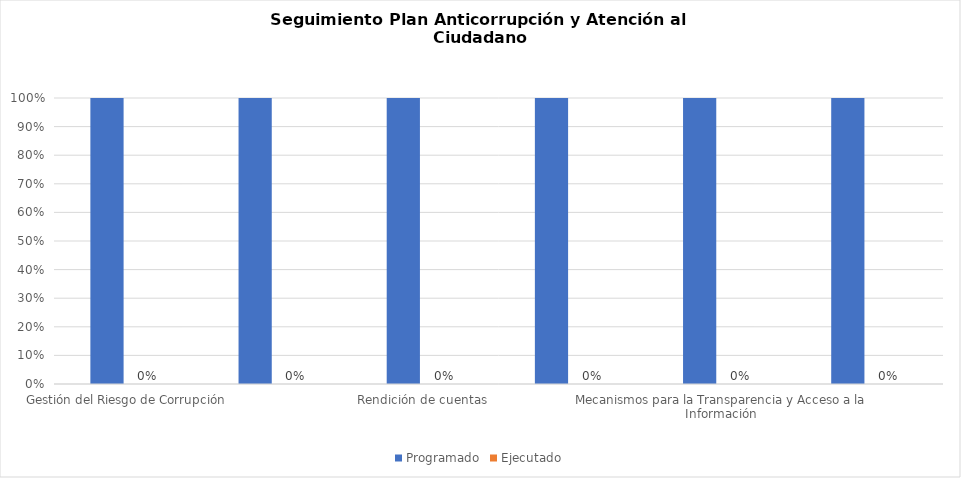
| Category | Programado | Ejecutado |
|---|---|---|
| Gestión del Riesgo de Corrupción | 1 | 0 |
| Racionalización de Trámites | 1 | 0 |
| Rendición de cuentas | 1 | 0 |
| Mecanismos para mejorar la Atención al Ciudadano | 1 | 0 |
| Mecanismos para la Transparencia y Acceso a la Información | 1 | 0 |
| Iniciativas adicionales | 1 | 0 |